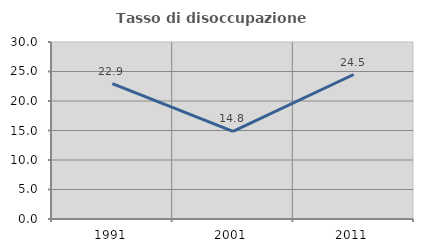
| Category | Tasso di disoccupazione giovanile  |
|---|---|
| 1991.0 | 22.944 |
| 2001.0 | 14.839 |
| 2011.0 | 24.49 |